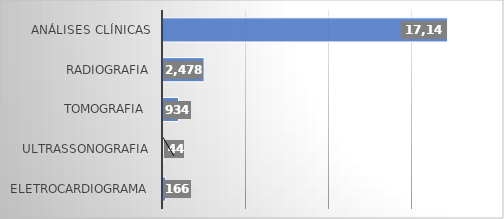
| Category | Series 0 |
|---|---|
| ELETROCARDIOGRAMA | 166 |
| ULTRASSONOGRAFIA | 44 |
| TOMOGRAFIA  | 934 |
| RADIOGRAFIA | 2478 |
| ANÁLISES CLÍNICAS | 17145 |